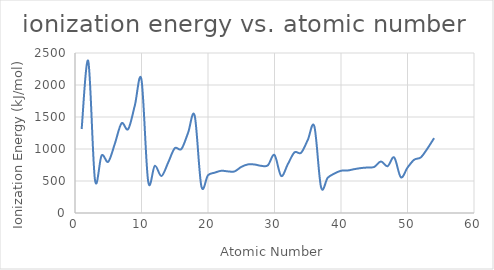
| Category | Series 0 |
|---|---|
| 1.0 | 1312 |
| 2.0 | 2372 |
| 3.0 | 520 |
| 4.0 | 899 |
| 5.0 | 801 |
| 6.0 | 1086 |
| 7.0 | 1402 |
| 8.0 | 1310 |
| 9.0 | 1681 |
| 10.0 | 2081 |
| 11.0 | 496 |
| 12.0 | 738 |
| 13.0 | 578 |
| 14.0 | 786 |
| 15.0 | 1012 |
| 16.0 | 1000 |
| 17.0 | 1251 |
| 18.0 | 1521 |
| 19.0 | 419 |
| 20.0 | 590 |
| 21.0 | 630 |
| 22.0 | 660 |
| 23.0 | 650 |
| 24.0 | 650 |
| 25.0 | 720 |
| 26.0 | 759 |
| 27.0 | 758 |
| 28.0 | 737 |
| 29.0 | 745 |
| 30.0 | 906 |
| 31.0 | 579 |
| 32.0 | 762 |
| 33.0 | 947 |
| 34.0 | 941 |
| 35.0 | 1140 |
| 36.0 | 1351 |
| 37.0 | 403 |
| 38.0 | 550 |
| 39.0 | 616 |
| 40.0 | 660 |
| 41.0 | 664 |
| 42.0 | 685 |
| 43.0 | 702 |
| 44.0 | 711 |
| 45.0 | 720 |
| 46.0 | 805 |
| 47.0 | 731 |
| 48.0 | 868 |
| 49.0 | 558 |
| 50.0 | 709 |
| 51.0 | 832 |
| 52.0 | 869 |
| 53.0 | 1008 |
| 54.0 | 1170 |